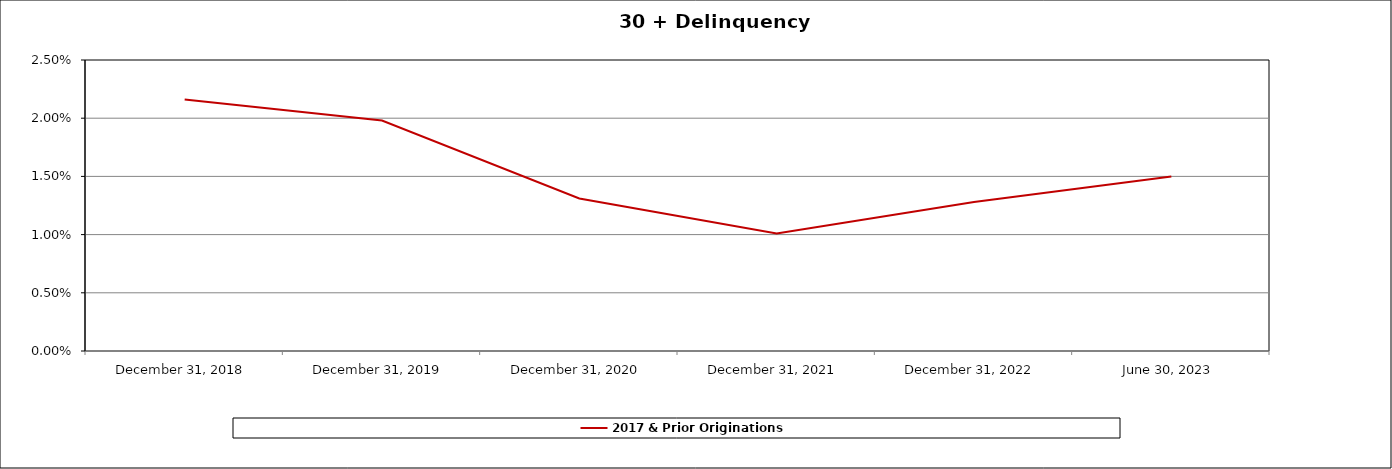
| Category | 2017 & Prior Originations |
|---|---|
| 2018-12-31 | 0.022 |
| 2019-12-31 | 0.02 |
| 2020-12-31 | 0.013 |
| 2021-12-31 | 0.01 |
| 2022-12-31 | 0.013 |
| 2023-06-30 | 0.015 |